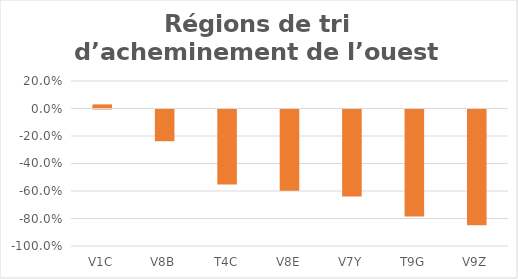
| Category | Series 0 |
|---|---|
| V1C | 0.03 |
| V8B | -0.231 |
| T4C | -0.545 |
| V8E | -0.591 |
| V7Y | -0.633 |
| T9G | -0.778 |
| V9Z | -0.842 |